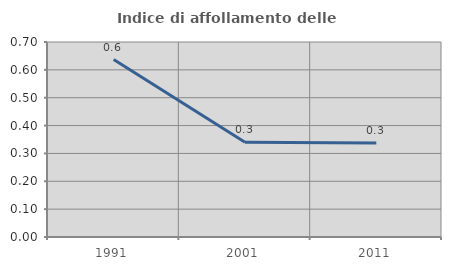
| Category | Indice di affollamento delle abitazioni  |
|---|---|
| 1991.0 | 0.637 |
| 2001.0 | 0.34 |
| 2011.0 | 0.338 |